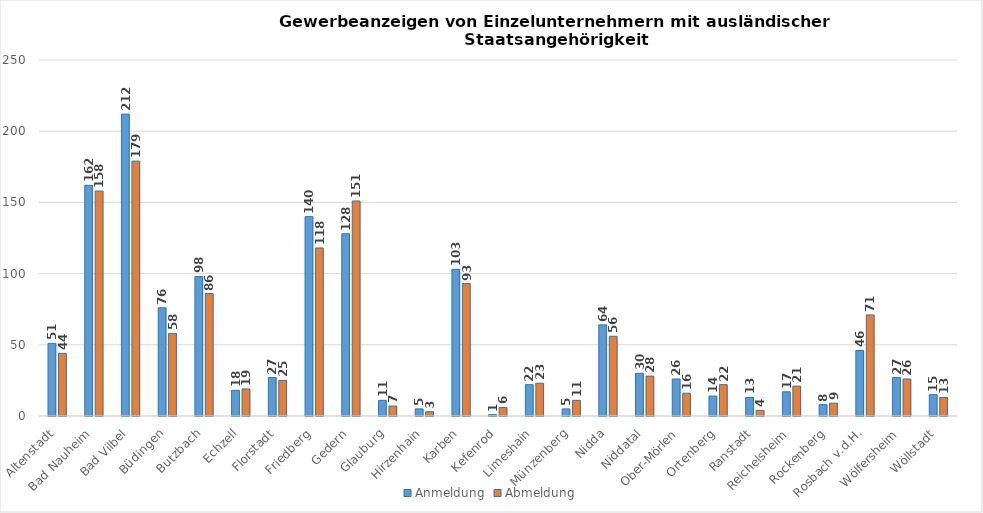
| Category | Anmeldung | Abmeldung |
|---|---|---|
| Altenstadt | 51 | 44 |
| Bad Nauheim | 162 | 158 |
| Bad Vilbel | 212 | 179 |
| Büdingen | 76 | 58 |
| Butzbach | 98 | 86 |
| Echzell | 18 | 19 |
| Florstadt | 27 | 25 |
| Friedberg | 140 | 118 |
| Gedern | 128 | 151 |
| Glauburg | 11 | 7 |
| Hirzenhain | 5 | 3 |
| Karben | 103 | 93 |
| Kefenrod | 1 | 6 |
| Limeshain | 22 | 23 |
| Münzenberg | 5 | 11 |
| Nidda | 64 | 56 |
| Niddatal | 30 | 28 |
| Ober-Mörlen | 26 | 16 |
| Ortenberg | 14 | 22 |
| Ranstadt | 13 | 4 |
| Reichelsheim | 17 | 21 |
| Rockenberg | 8 | 9 |
| Rosbach v.d.H. | 46 | 71 |
| Wölfersheim | 27 | 26 |
| Wöllstadt | 15 | 13 |